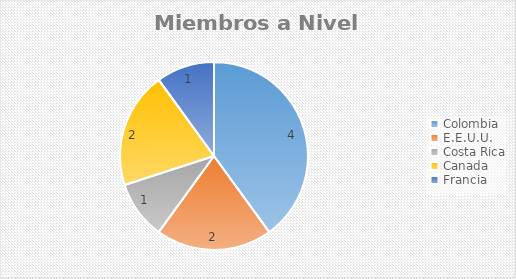
| Category | Series 0 |
|---|---|
| Colombia | 4 |
| E.E.U.U. | 2 |
| Costa Rica | 1 |
| Canada | 2 |
| Francia | 1 |